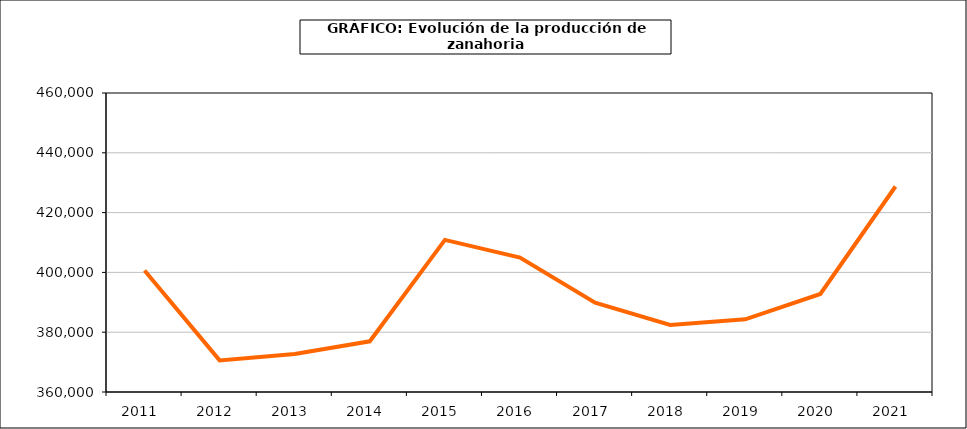
| Category | producción |
|---|---|
| 2011.0 | 400628 |
| 2012.0 | 370570 |
| 2013.0 | 372714 |
| 2014.0 | 376952 |
| 2015.0 | 410865 |
| 2016.0 | 404962 |
| 2017.0 | 389844 |
| 2018.0 | 382427 |
| 2019.0 | 384295 |
| 2020.0 | 392774 |
| 2021.0 | 428726 |